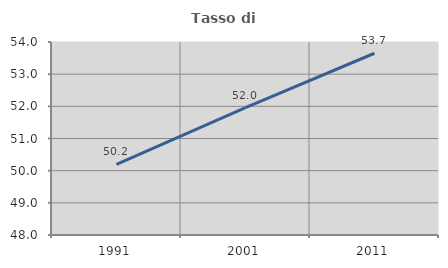
| Category | Tasso di occupazione   |
|---|---|
| 1991.0 | 50.199 |
| 2001.0 | 51.958 |
| 2011.0 | 53.65 |